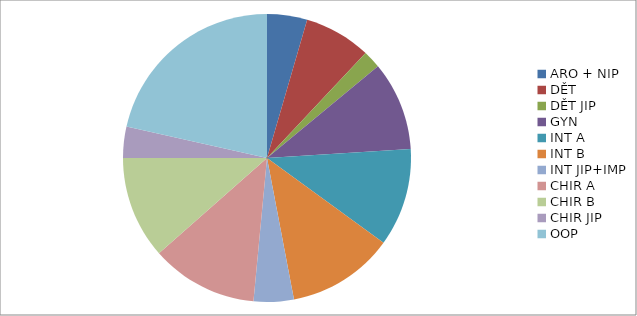
| Category | Series 0 | Series 1 | Series 2 | Series 3 | Series 4 | Series 5 | Series 6 | Series 7 |
|---|---|---|---|---|---|---|---|---|
| ARO + NIP | 9 | 60 | 60 | 12 | 0.2 | 0.2 | 3 | 0.05 |
| DĚT | 15 | 0 | 0 | 0 | 0 | 0 | 0 | 0 |
| DĚT JIP | 4 | 0 | 0 | 0 | 0 | 0 | 0 | 0 |
| GYN | 20 | 47 | 0 | 0 | 0 | 0 | 0 | 0 |
| INT A | 22 | 277 | 137 | 32 | 0.116 | 0.234 | 0 | 0 |
| INT B | 24 | 271 | 139 | 25 | 0.092 | 0.18 | 7 | 0.026 |
| INT JIP+IMP | 9 | 88 | 31 | 2 | 0.023 | 0.065 | 1 | 0.011 |
| CHIR A | 24 | 246 | 66 | 6 | 0.024 | 0.091 | 2 | 0.008 |
| CHIR B | 23 | 148 | 63 | 18 | 0.122 | 0.286 | 0 | 0 |
| CHIR JIP | 7 | 67 | 60 | 4 | 0.06 | 0.067 | 2 | 0.03 |
| OOP | 43 | 301 | 233 | 109 | 0.362 | 0.468 | 22 | 0.073 |